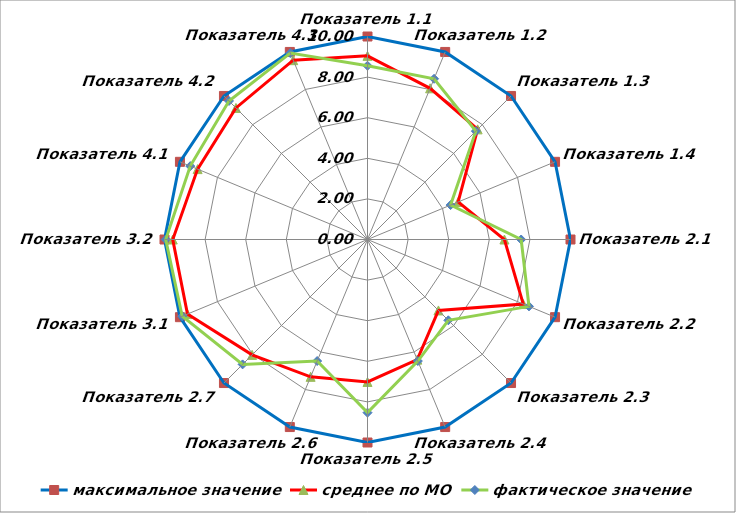
| Category | максимальное значение | среднее по МО | фактическое значение |
|---|---|---|---|
| Показатель 1.1 | 10 | 9.046 | 8.56 |
| Показатель 1.2 | 10 | 8.061 | 8.57 |
| Показатель 1.3 | 10 | 7.673 | 7.55 |
| Показатель 1.4 | 10 | 4.833 | 4.43 |
| Показатель 2.1 | 10 | 6.745 | 7.57 |
| Показатель 2.2 | 10 | 8.305 | 8.61 |
| Показатель 2.3 | 10 | 4.943 | 5.63 |
| Показатель 2.4 | 10 | 6.405 | 6.48 |
| Показатель 2.5 | 10 | 7.017 | 8.53 |
| Показатель 2.6 | 10 | 7.323 | 6.48 |
| Показатель 2.7 | 10 | 8.039 | 8.7 |
| Показатель 3.1 | 10 | 9.599 | 9.88 |
| Показатель 3.2 | 10 | 9.593 | 9.94 |
| Показатель 4.1 | 10 | 9.059 | 9.45 |
| Показатель 4.2 | 10 | 9.164 | 9.65 |
| Показатель 4.3 | 10 | 9.561 | 9.94 |